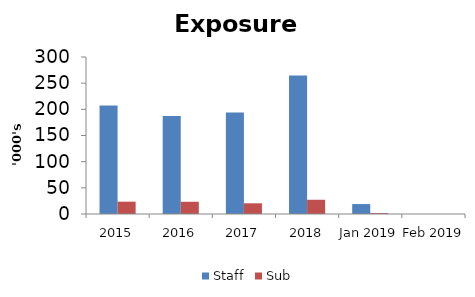
| Category | Staff | Sub |
|---|---|---|
| 2015 | 207536 | 23530 |
| 2016 | 187194 | 23350 |
| 2017 | 193983 | 20442 |
| 2018 | 264467 | 27213 |
| Jan 2019 | 18969 | 1810 |
| Feb 2019 | 0 | 0 |